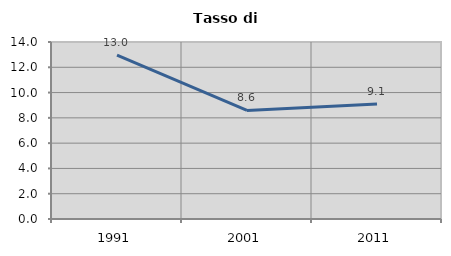
| Category | Tasso di disoccupazione   |
|---|---|
| 1991.0 | 12.956 |
| 2001.0 | 8.588 |
| 2011.0 | 9.102 |